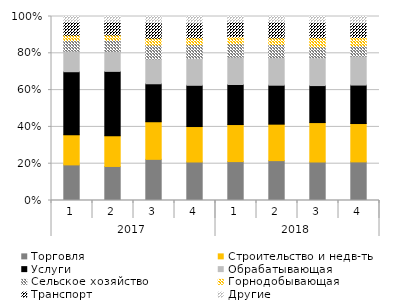
| Category | Торговля | Строительство и недв-ть | Услуги | Обрабатывающая | Сельское хозяйство | Горнодобывающая | Транспорт | Другие |
|---|---|---|---|---|---|---|---|---|
| 0 | 0.194 | 0.164 | 0.342 | 0.112 | 0.057 | 0.029 | 0.072 | 0.03 |
| 1 | 0.185 | 0.167 | 0.35 | 0.109 | 0.06 | 0.029 | 0.07 | 0.03 |
| 2 | 0.224 | 0.204 | 0.206 | 0.135 | 0.076 | 0.037 | 0.084 | 0.034 |
| 3 | 0.209 | 0.193 | 0.224 | 0.147 | 0.074 | 0.037 | 0.08 | 0.035 |
| 4 | 0.211 | 0.201 | 0.218 | 0.149 | 0.072 | 0.038 | 0.08 | 0.03 |
| 5 | 0.217 | 0.198 | 0.212 | 0.15 | 0.071 | 0.036 | 0.085 | 0.031 |
| 6 | 0.209 | 0.214 | 0.201 | 0.151 | 0.059 | 0.05 | 0.082 | 0.033 |
| 7 | 0.21 | 0.208 | 0.209 | 0.157 | 0.056 | 0.046 | 0.079 | 0.035 |